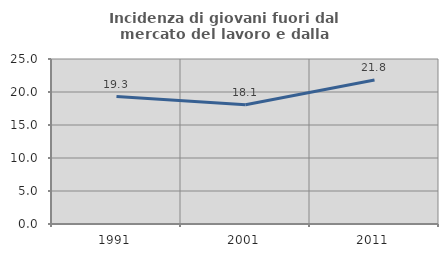
| Category | Incidenza di giovani fuori dal mercato del lavoro e dalla formazione  |
|---|---|
| 1991.0 | 19.313 |
| 2001.0 | 18.082 |
| 2011.0 | 21.827 |